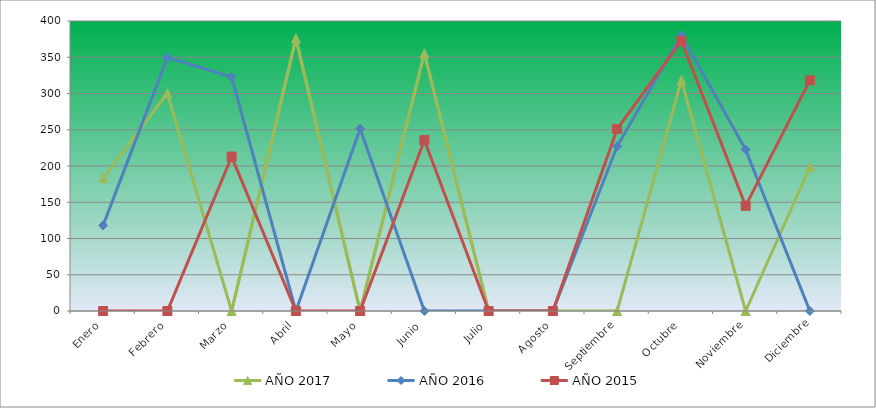
| Category | AÑO 2017 | AÑO 2016 | AÑO 2015 |
|---|---|---|---|
| Enero | 183.323 | 118.087 | 0 |
| Febrero | 300.156 | 349.753 | 0 |
| Marzo | 0 | 322.71 | 213.011 |
| Abril | 376.145 | 0 | 0 |
| Mayo | 0 | 251.498 | 0 |
| Junio | 355.248 | 0 | 235.671 |
| Julio | 0 | 0 | 0 |
| Agosto | 0 | 0 | 0 |
| Septiembre | 0 | 227.159 | 251.081 |
| Octubre | 318.203 | 380.402 | 372.542 |
| Noviembre | 0 | 222.652 | 145.029 |
| Diciembre | 198.521 | 0 | 318.156 |